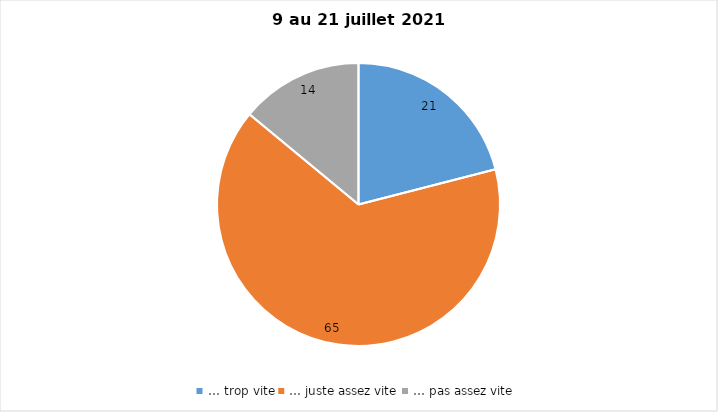
| Category | Series 0 |
|---|---|
| … trop vite | 21 |
| … juste assez vite | 65 |
| … pas assez vite | 14 |